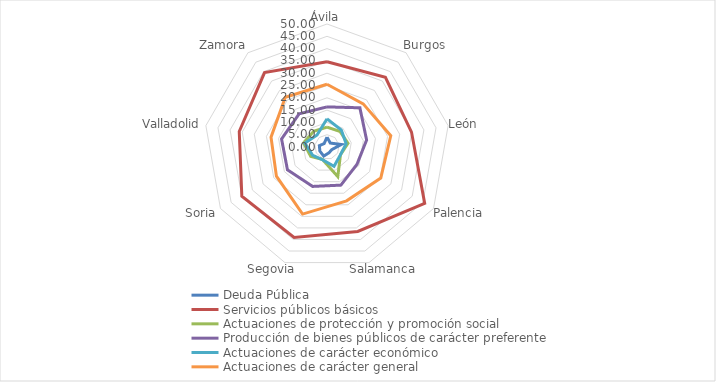
| Category | Deuda Pública | Servicios públicos básicos | Actuaciones de protección y promoción social | Producción de bienes públicos de carácter preferente | Actuaciones de carácter económico | Actuaciones de carácter general |
|---|---|---|---|---|---|---|
| Ávila | 4.012 | 34.665 | 8.069 | 16.302 | 11.45 | 25.502 |
| Burgos | 2.086 | 36.945 | 8.244 | 20.801 | 9.031 | 22.893 |
| León | 5.898 | 34.883 | 8.659 | 16.351 | 7.886 | 26.324 |
| Palencia | 2.196 | 45.857 | 6.321 | 14.074 | 6.309 | 25.242 |
| Salamanca | 2.478 | 36.542 | 12.817 | 16.497 | 8.362 | 23.304 |
| Segovia | 3.925 | 39.126 | 5.387 | 17.055 | 5.481 | 29.026 |
| Soria | 3.35 | 39.98 | 7.631 | 18.558 | 6.736 | 23.745 |
| Valladolid | 3.147 | 36.22 | 9.641 | 18.756 | 9.127 | 23.109 |
| Zamora | 1.813 | 39.496 | 8.377 | 17.612 | 6.328 | 26.374 |